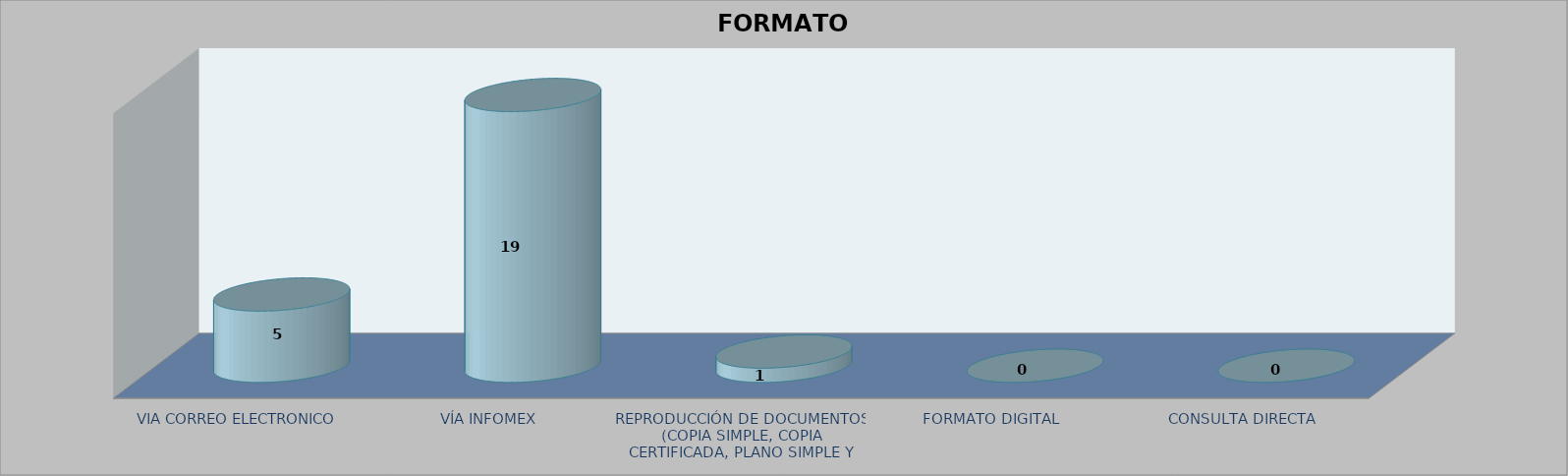
| Category |        FORMATO SOLICITADO | Series 1 | Series 2 |
|---|---|---|---|
| VIA CORREO ELECTRONICO |  |  | 5 |
| VÍA INFOMEX |  |  | 19 |
| REPRODUCCIÓN DE DOCUMENTOS (COPIA SIMPLE, COPIA CERTIFICADA, PLANO SIMPLE Y PLANO CERTIFICADO) |  |  | 1 |
| FORMATO DIGITAL |  |  | 0 |
| CONSULTA DIRECTA |  |  | 0 |